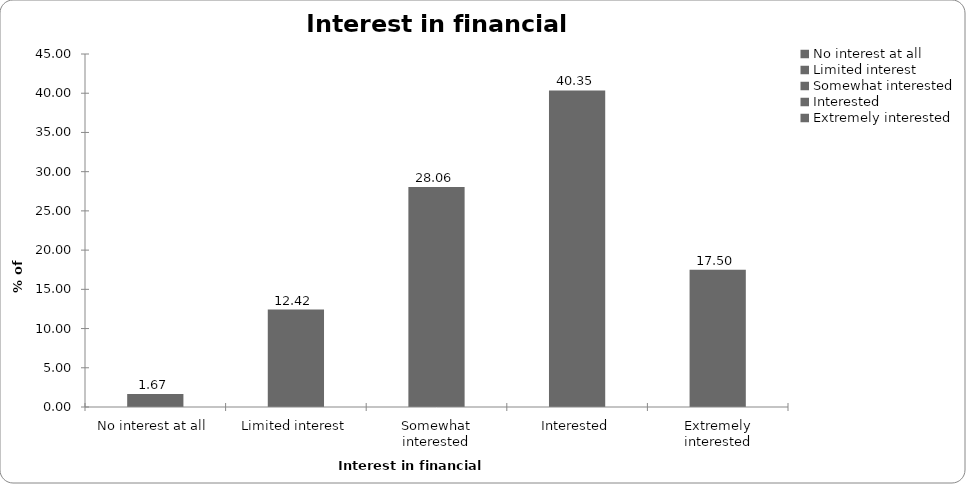
| Category | Interest in financial planning |
|---|---|
| No interest at all | 1.67 |
| Limited interest | 12.425 |
| Somewhat interested | 28.056 |
| Interested | 40.347 |
| Extremely interested | 17.502 |